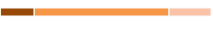
| Category | Series 0 | Series 1 | Series 2 |
|---|---|---|---|
| 0 | 0.161 | 0.638 | 0.201 |